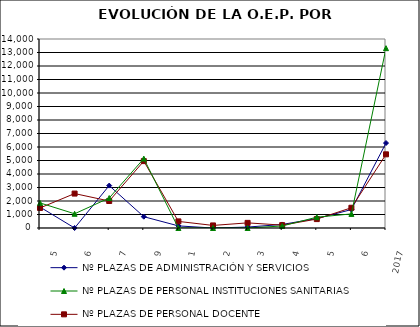
| Category | Nº PLAZAS DE ADMINISTRACIÓN Y SERVICIOS |
|---|---|
| 2005.0 | 1553 |
| 2006.0 | 0 |
| 2007.0 | 3142 |
| 2009.0 | 837 |
| 2011.0 | 156 |
| 2012.0 | 0 |
| 2013.0 | 69 |
| 2014.0 | 262 |
| 2015.0 | 702 |
| 2016.0 | 1364 |
| 2017.0 | 6293 |